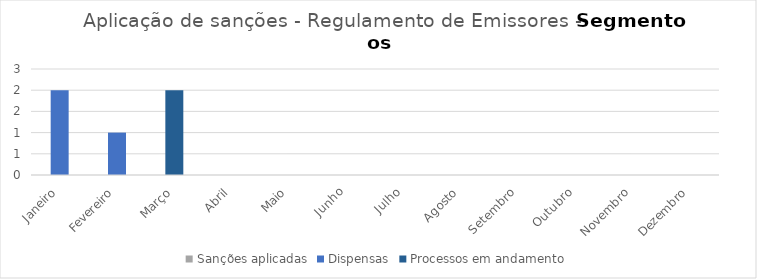
| Category | Sanções aplicadas | Dispensas | Processos em andamento |
|---|---|---|---|
| Janeiro | 0 | 2 | 0 |
| Fevereiro | 0 | 1 | 0 |
| Março | 0 | 0 | 2 |
| Abril | 0 | 0 | 0 |
| Maio | 0 | 0 | 0 |
| Junho | 0 | 0 | 0 |
| Julho | 0 | 0 | 0 |
| Agosto | 0 | 0 | 0 |
| Setembro | 0 | 0 | 0 |
| Outubro | 0 | 0 | 0 |
| Novembro | 0 | 0 | 0 |
| Dezembro | 0 | 0 | 0 |